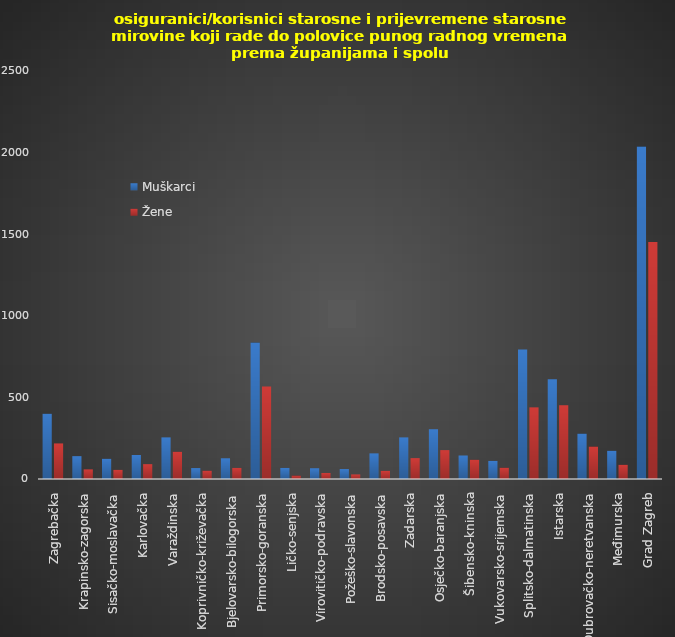
| Category | Muškarci | Žene |
|---|---|---|
| Zagrebačka | 400 | 218 |
| Krapinsko-zagorska | 140 | 59 |
| Sisačko-moslavačka | 124 | 56 |
| Karlovačka | 147 | 91 |
| Varaždinska | 255 | 167 |
| Koprivničko-križevačka | 67 | 51 |
| Bjelovarsko-bilogorska | 127 | 68 |
| Primorsko-goranska | 836 | 567 |
| Ličko-senjska | 68 | 21 |
| Virovitičko-podravska | 66 | 37 |
| Požeško-slavonska | 61 | 28 |
| Brodsko-posavska | 157 | 50 |
| Zadarska | 255 | 128 |
| Osječko-baranjska | 305 | 177 |
| Šibensko-kninska | 144 | 118 |
| Vukovarsko-srijemska | 111 | 69 |
| Splitsko-dalmatinska | 794 | 439 |
| Istarska | 611 | 452 |
| Dubrovačko-neretvanska | 278 | 199 |
| Međimurska | 173 | 87 |
| Grad Zagreb | 2037 | 1452 |